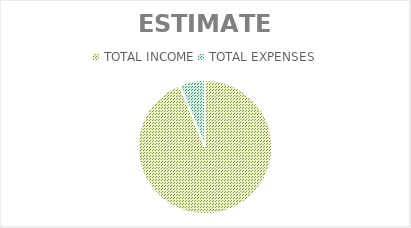
| Category | Series 0 |
|---|---|
| TOTAL INCOME | 5300 |
| TOTAL EXPENSES | 350 |